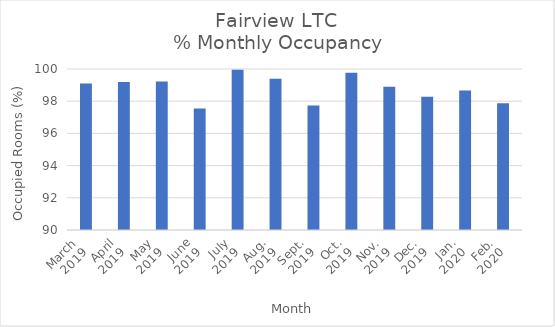
| Category | % Monthly Occupancy |
|---|---|
| March
2019 | 99.1 |
| April
2019 | 99.2 |
| May
2019 | 99.23 |
| June
2019 | 97.54 |
| July
2019 | 99.96 |
| Aug.
2019 | 99.39 |
| Sept.
2019 | 97.74 |
| Oct.
2019 | 99.77 |
| Nov.
2019 | 98.89 |
| Dec.
2019 | 98.27 |
| Jan.
2020 | 98.66 |
| Feb.
2020 | 97.87 |